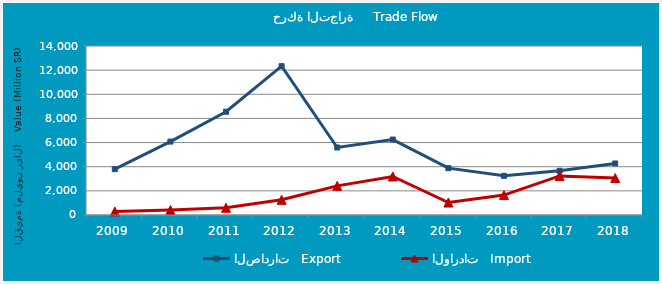
| Category | الصادرات   Export | الواردات   Import |
|---|---|---|
| 2009.0 | 3798528673 | 289976494 |
| 2010.0 | 6081962607 | 417857171 |
| 2011.0 | 8554540626 | 601296836 |
| 2012.0 | 12330640713 | 1258086376 |
| 2013.0 | 5591188994 | 2413286054 |
| 2014.0 | 6250692173 | 3189394202 |
| 2015.0 | 3879452567 | 1031724746 |
| 2016.0 | 3244019708 | 1649495807 |
| 2017.0 | 3660535280 | 3235212966 |
| 2018.0 | 4267886782 | 3059140878 |